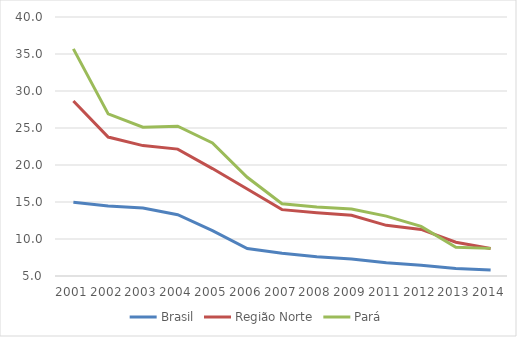
| Category | Brasil | Região Norte | Pará |
|---|---|---|---|
| 2001.0 | 14.955 | 28.66 | 35.692 |
| 2002.0 | 14.475 | 23.779 | 26.905 |
| 2003.0 | 14.19 | 22.619 | 25.104 |
| 2004.0 | 13.285 | 22.145 | 25.243 |
| 2005.0 | 11.14 | 19.518 | 22.975 |
| 2006.0 | 8.721 | 16.753 | 18.339 |
| 2007.0 | 8.08 | 13.97 | 14.761 |
| 2008.0 | 7.593 | 13.543 | 14.322 |
| 2009.0 | 7.309 | 13.198 | 14.046 |
| 2011.0 | 6.776 | 11.848 | 13.095 |
| 2012.0 | 6.452 | 11.29 | 11.708 |
| 2013.0 | 6.009 | 9.568 | 8.87 |
| 2014.0 | 5.816 | 8.718 | 8.733 |